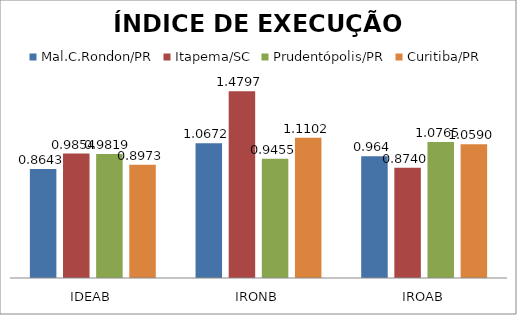
| Category | Mal.C.Rondon/PR | Itapema/SC | Prudentópolis/PR | Toledo/PR | Cascavel/PR | Curitiba/PR |
|---|---|---|---|---|---|---|
| IDEAB | 0.864 | 0.985 | 0.982 |  |  | 0.897 |
| IRONB | 1.067 | 1.48 | 0.946 |  |  | 1.11 |
| IROAB | 0.964 | 0.874 | 1.077 |  |  | 1.059 |